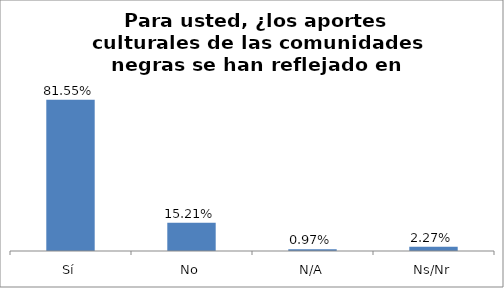
| Category | Total |
|---|---|
| Sí | 0.816 |
| No | 0.152 |
| N/A | 0.01 |
| Ns/Nr | 0.023 |